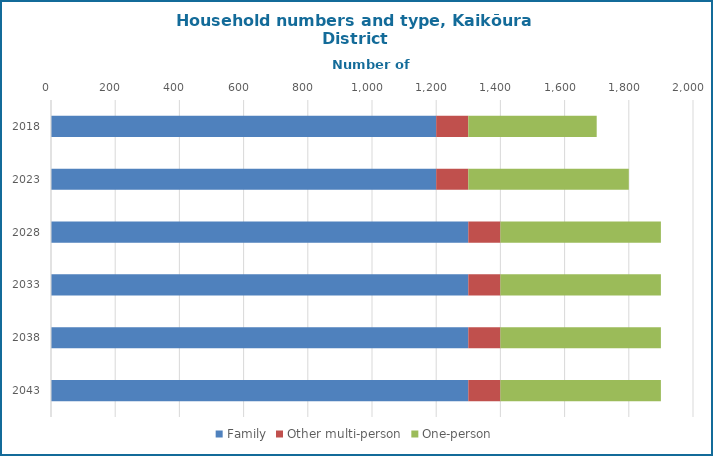
| Category | Family | Other multi-person | One-person |
|---|---|---|---|
| 2018.0 | 1200 | 100 | 400 |
| 2023.0 | 1200 | 100 | 500 |
| 2028.0 | 1300 | 100 | 500 |
| 2033.0 | 1300 | 100 | 500 |
| 2038.0 | 1300 | 100 | 500 |
| 2043.0 | 1300 | 100 | 500 |